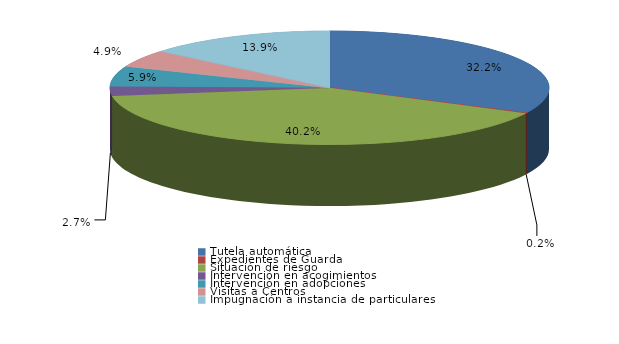
| Category | Series 0 |
|---|---|
| Tutela automática | 132 |
| Expedientes de Guarda | 1 |
| Situación de riesgo | 165 |
| Intervención en acogimientos | 11 |
| Intervención en adopciones | 24 |
| Defensa de los derechos fundamentales | 0 |
| Sustracción internacional de menores | 0 |
| Visitas a Centros | 20 |
| Ensayos Clínicos | 0 |
| Impugnación a instacia del Fiscal | 0 |
| Impugnación a instancia de particulares | 57 |